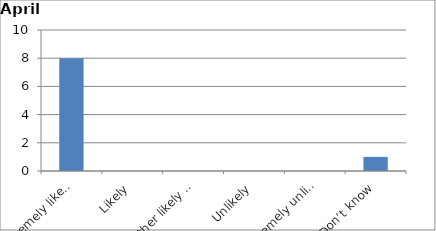
| Category | Series 0 |
|---|---|
| Extremely likely | 8 |
| Likely | 0 |
| Neither likely nor unlikely | 0 |
| Unlikely | 0 |
| Extremely unlikely | 0 |
| Don’t know | 1 |